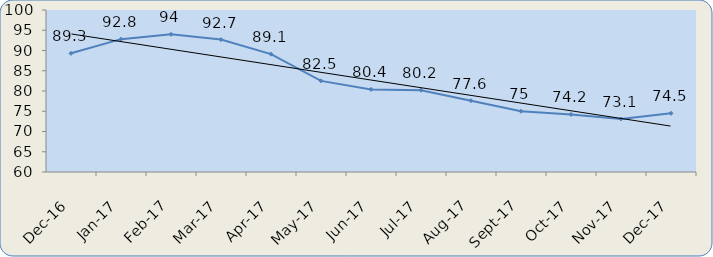
| Category | dez/16 jan/17 fev/17 mar/17 abr/17 mai/17 jun/17 jul/17 ago/17 set/17 out/17 nov/17 dez/17 |
|---|---|
| 2016-12-01 | 89.3 |
| 2017-01-01 | 92.8 |
| 2017-02-01 | 94 |
| 2017-03-01 | 92.7 |
| 2017-04-01 | 89.1 |
| 2017-05-01 | 82.5 |
| 2017-06-01 | 80.4 |
| 2017-07-01 | 80.2 |
| 2017-08-01 | 77.6 |
| 2017-09-01 | 75 |
| 2017-10-01 | 74.2 |
| 2017-11-01 | 73.1 |
| 2017-12-01 | 74.5 |